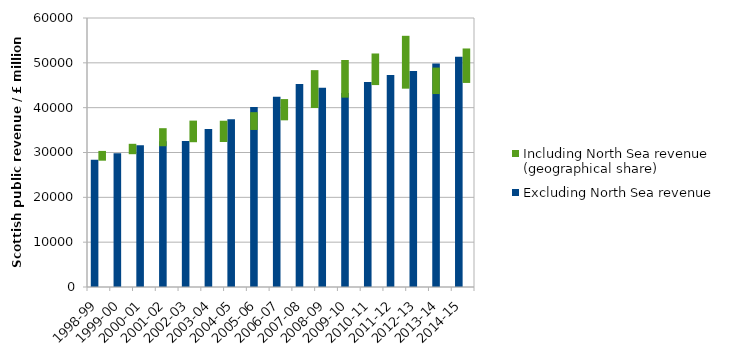
| Category | Excluding North Sea revenue | Including North Sea revenue (geographical share) |
|---|---|---|
| 1998-99 | 28395 | 1957 |
| 1999-00 | 29843 | 2096 |
| 2000-01 | 31620 | 3802 |
| 2001-02 | 32517 | 4597 |
| 2002-03 | 32560 | 4525 |
| 2003-04 | 35253 | 3742 |
| 2004-05 | 37401 | 4514 |
| 2005-06 | 40144 | 8226 |
| 2006-07 | 42460 | 8174 |
| 2007-08 | 45262 | 6824 |
| 2008-09 | 44459 | 11570 |
| 2009-10 | 43263 | 5678 |
| 2010-11 | 45739 | 7465 |
| 2011-12 | 47290 | 9632 |
| 2012-13 | 48188 | 5290 |
| 2013-14 | 49862 | 4024 |
| 2014-15 | 51361 | 1788 |